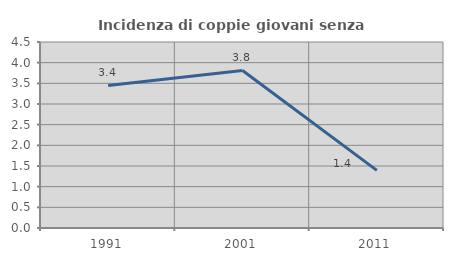
| Category | Incidenza di coppie giovani senza figli |
|---|---|
| 1991.0 | 3.448 |
| 2001.0 | 3.811 |
| 2011.0 | 1.394 |